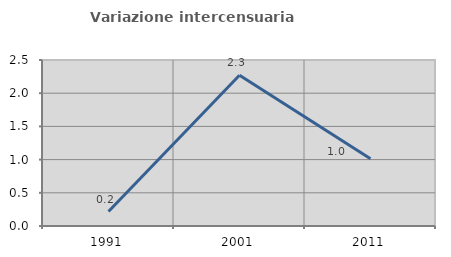
| Category | Variazione intercensuaria annua |
|---|---|
| 1991.0 | 0.217 |
| 2001.0 | 2.27 |
| 2011.0 | 1.012 |